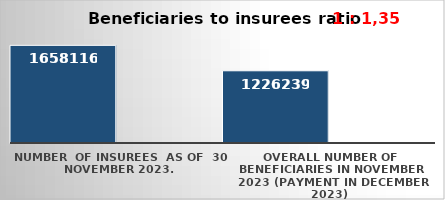
| Category | Series 0 | Series 1 |
|---|---|---|
| NUMBER  of insurees  as of  30 November 2023. | 1658116 |  |
| OVERALL number of beneficiaries in November 2023 (payment in December 2023) | 1226239 |  |